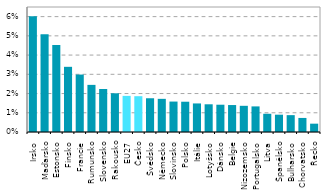
| Category | Series 0 |
|---|---|
| Irsko | 0.06 |
| Maďarsko | 0.051 |
| Estonsko | 0.045 |
| Finsko | 0.034 |
| Francie | 0.03 |
| Rumunsko | 0.025 |
| Slovensko | 0.022 |
| Rakousko | 0.02 |
| EU27 | 0.019 |
| Česko | 0.019 |
| Švédsko | 0.018 |
| Německo | 0.017 |
| Slovinsko | 0.016 |
| Polsko | 0.016 |
| Itálie | 0.015 |
| Lotyšsko | 0.014 |
| Dánsko | 0.014 |
| Belgie | 0.014 |
| Nizozemsko | 0.014 |
| Portugalsko | 0.013 |
| Litva | 0.009 |
| Španělsko | 0.009 |
| Bulharsko | 0.009 |
| Chorvatsko | 0.007 |
| Řecko | 0.004 |